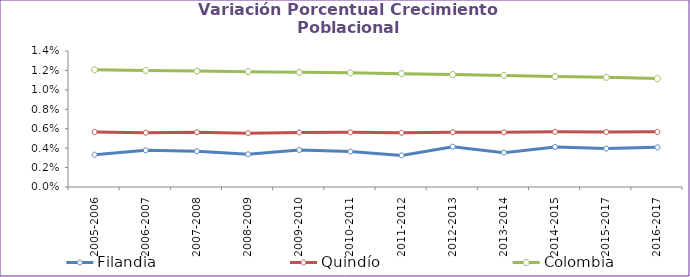
| Category | Filandia | Quindío | Colombia |
|---|---|---|---|
| 2005-2006 | 0.003 | 0.006 | 0.012 |
| 2006-2007 | 0.004 | 0.006 | 0.012 |
| 2007-2008 | 0.004 | 0.006 | 0.012 |
| 2008-2009 | 0.003 | 0.006 | 0.012 |
| 2009-2010 | 0.004 | 0.006 | 0.012 |
| 2010-2011 | 0.004 | 0.006 | 0.012 |
| 2011-2012 | 0.003 | 0.006 | 0.012 |
| 2012-2013 | 0.004 | 0.006 | 0.012 |
| 2013-2014 | 0.004 | 0.006 | 0.011 |
| 2014-2015 | 0.004 | 0.006 | 0.011 |
| 2015-2017 | 0.004 | 0.006 | 0.011 |
| 2016-2017 | 0.004 | 0.006 | 0.011 |